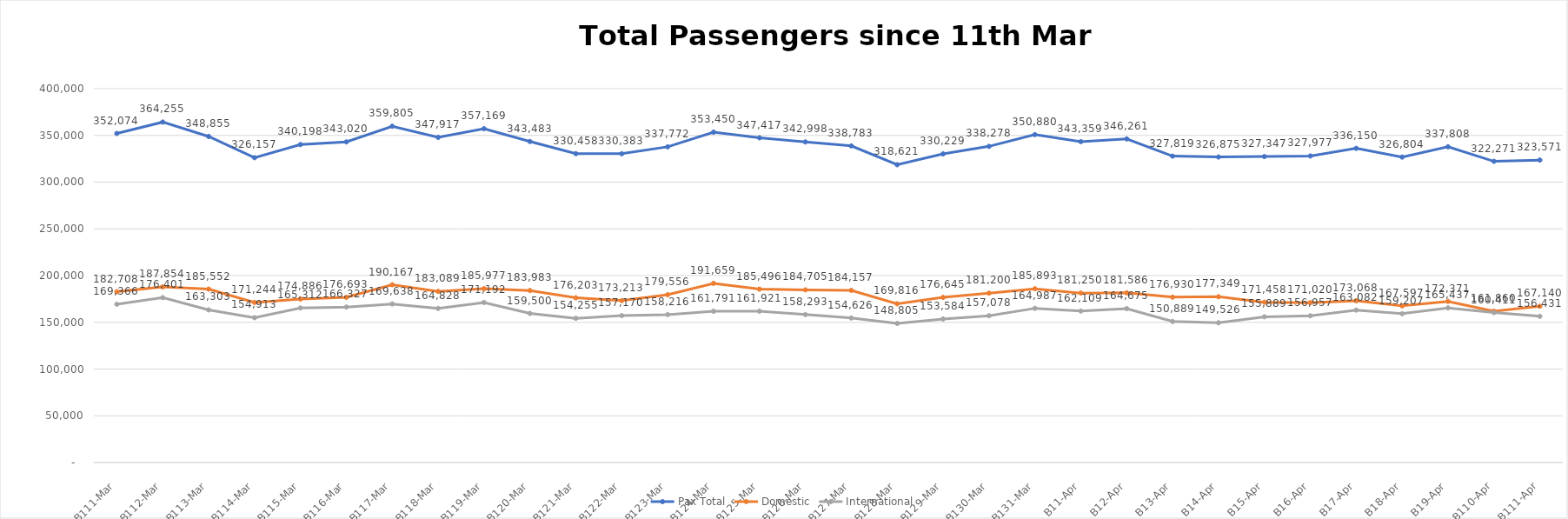
| Category | Pax Total |  Domestic  |  International  |
|---|---|---|---|
| 2023-03-11 | 352074 | 182708 | 169366 |
| 2023-03-12 | 364255 | 187854 | 176401 |
| 2023-03-13 | 348855 | 185552 | 163303 |
| 2023-03-14 | 326157 | 171244 | 154913 |
| 2023-03-15 | 340198 | 174886 | 165312 |
| 2023-03-16 | 343020 | 176693 | 166327 |
| 2023-03-17 | 359805 | 190167 | 169638 |
| 2023-03-18 | 347917 | 183089 | 164828 |
| 2023-03-19 | 357169 | 185977 | 171192 |
| 2023-03-20 | 343483 | 183983 | 159500 |
| 2023-03-21 | 330458 | 176203 | 154255 |
| 2023-03-22 | 330383 | 173213 | 157170 |
| 2023-03-23 | 337772 | 179556 | 158216 |
| 2023-03-24 | 353450 | 191659 | 161791 |
| 2023-03-25 | 347417 | 185496 | 161921 |
| 2023-03-26 | 342998 | 184705 | 158293 |
| 2023-03-27 | 338783 | 184157 | 154626 |
| 2023-03-28 | 318621 | 169816 | 148805 |
| 2023-03-29 | 330229 | 176645 | 153584 |
| 2023-03-30 | 338278 | 181200 | 157078 |
| 2023-03-31 | 350880 | 185893 | 164987 |
| 2023-04-01 | 343359 | 181250 | 162109 |
| 2023-04-02 | 346261 | 181586 | 164675 |
| 2023-04-03 | 327819 | 176930 | 150889 |
| 2023-04-04 | 326875 | 177349 | 149526 |
| 2023-04-05 | 327347 | 171458 | 155889 |
| 2023-04-06 | 327977 | 171020 | 156957 |
| 2023-04-07 | 336150 | 173068 | 163082 |
| 2023-04-08 | 326804 | 167597 | 159207 |
| 2023-04-09 | 337808 | 172371 | 165437 |
| 2023-04-10 | 322271 | 161860 | 160411 |
| 2023-04-11 | 323571 | 167140 | 156431 |